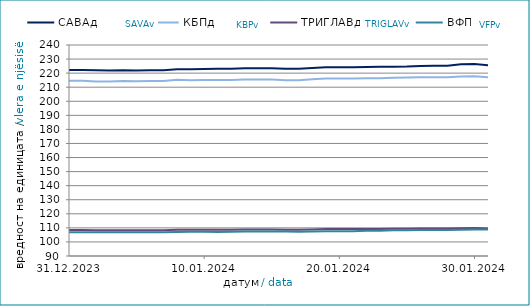
| Category | САВАд | КБПд | ТРИГЛАВд | ВФПд |
|---|---|---|---|---|
| 2023-12-31 | 222.264 | 214.619 | 108.443 | 106.889 |
| 2024-01-01 | 222.274 | 214.627 | 108.449 | 106.894 |
| 2024-01-02 | 222.038 | 214.122 | 108.241 | 106.866 |
| 2024-01-03 | 221.911 | 214.137 | 108.24 | 106.829 |
| 2024-01-04 | 222.109 | 214.348 | 108.309 | 106.959 |
| 2024-01-05 | 221.934 | 214.234 | 108.272 | 106.866 |
| 2024-01-06 | 222.099 | 214.42 | 108.352 | 106.9 |
| 2024-01-07 | 222.109 | 214.429 | 108.358 | 106.907 |
| 2024-01-08 | 222.771 | 215.222 | 108.699 | 106.975 |
| 2024-01-09 | 222.69 | 214.956 | 108.601 | 107.166 |
| 2024-01-10 | 222.936 | 215.195 | 108.709 | 107.208 |
| 2024-01-11 | 223.11 | 215.178 | 108.696 | 107.083 |
| 2024-01-12 | 223.192 | 215.171 | 108.665 | 107.325 |
| 2024-01-13 | 223.503 | 215.514 | 108.802 | 107.403 |
| 2024-01-14 | 223.513 | 215.524 | 108.808 | 107.41 |
| 2024-01-15 | 223.539 | 215.522 | 108.821 | 107.37 |
| 2024-01-16 | 223.039 | 214.995 | 108.613 | 107.383 |
| 2024-01-17 | 223.165 | 214.95 | 108.607 | 107.276 |
| 2024-01-18 | 223.602 | 215.581 | 108.863 | 107.445 |
| 2024-01-19 | 224.127 | 216.251 | 109.127 | 107.6 |
| 2024-01-20 | 224.137 | 216.261 | 109.134 | 107.607 |
| 2024-01-21 | 224.147 | 216.27 | 109.14 | 107.613 |
| 2024-01-22 | 224.358 | 216.406 | 109.231 | 107.957 |
| 2024-01-23 | 224.497 | 216.425 | 109.244 | 107.952 |
| 2024-01-24 | 224.606 | 216.749 | 109.361 | 108.245 |
| 2024-01-25 | 224.732 | 216.811 | 109.417 | 108.295 |
| 2024-01-26 | 225.153 | 217.004 | 109.492 | 108.435 |
| 2024-01-27 | 225.278 | 217.141 | 109.55 | 108.462 |
| 2024-01-28 | 225.287 | 217.15 | 109.557 | 108.469 |
| 2024-01-29 | 226.265 | 217.609 | 109.763 | 108.583 |
| 2024-01-30 | 226.476 | 217.84 | 109.858 | 108.828 |
| 2024-01-31 | 225.669 | 217.005 | 109.475 | 108.809 |